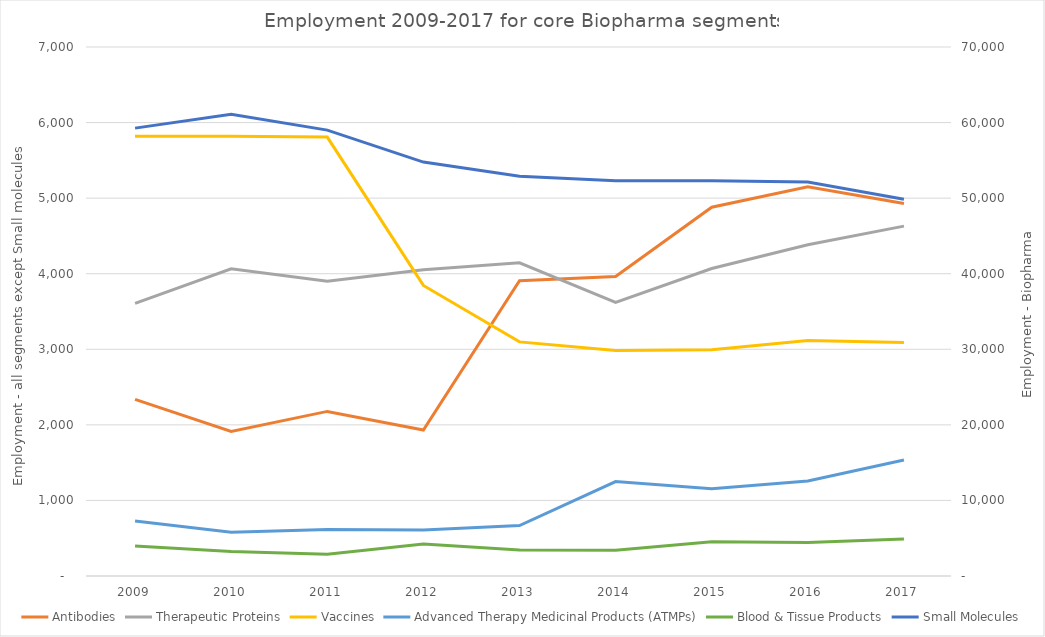
| Category | Antibodies | Therapeutic Proteins | Vaccines | Advanced Therapy Medicinal Products (ATMPs) | Blood & Tissue Products |
|---|---|---|---|---|---|
| 2009 | 2338 | 3607 | 5818 | 729 | 396 |
| 2010 | 1912 | 4065 | 5820 | 578 | 325 |
| 2011 | 2178 | 3902 | 5808 | 614 | 288 |
| 2012 | 1931 | 4051 | 3845 | 608 | 422 |
| 2013 | 3908 | 4144 | 3098 | 667 | 344 |
| 2014 | 3963 | 3619 | 2984 | 1250 | 342 |
| 2015 | 4880 | 4069 | 2995 | 1153 | 454 |
| 2016 | 5149 | 4383 | 3116 | 1256 | 444 |
| 2017 | 4930 | 4630 | 3089 | 1534 | 490 |